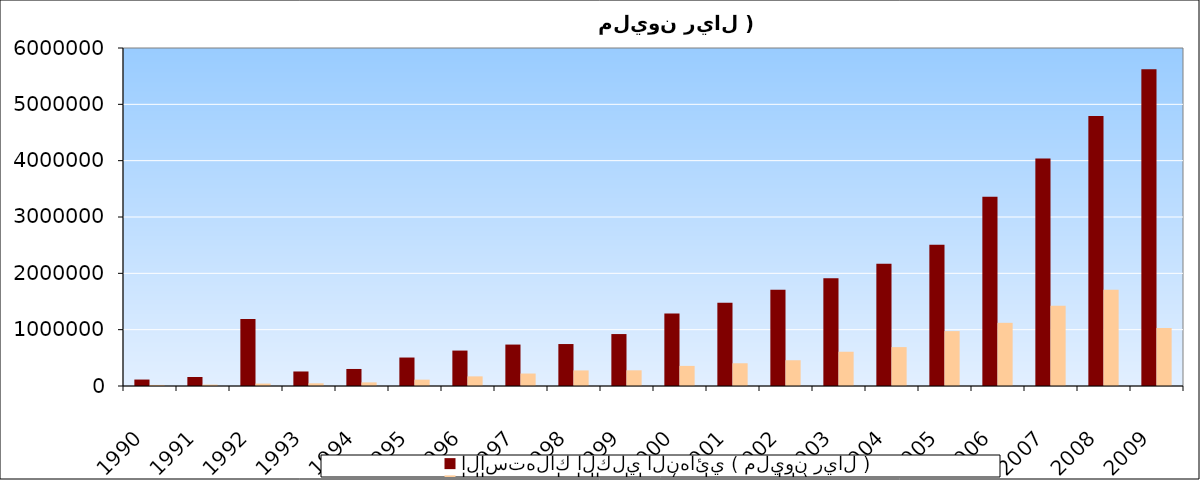
| Category | الاستهلاك الكلي النهائي ( مليون ريال ) | الاستثمار الاجمالي  ( مليون ريال ) |
|---|---|---|
| 1990.0 | 114486 | 18406 |
| 1991.0 | 160028 | 24334 |
| 1992.0 | 1191460 | 43026 |
| 1993.0 | 257732 | 48249 |
| 1994.0 | 302338 | 64390 |
| 1995.0 | 505363 | 112713 |
| 1996.0 | 628881 | 170879 |
| 1997.0 | 735533 | 221215 |
| 1998.0 | 744902 | 276465 |
| 1999.0 | 921968 | 278493 |
| 2000.0 | 1287957 | 356652.994 |
| 2001.0 | 1478665 | 403564.763 |
| 2002.0 | 1707543 | 457262.871 |
| 2003.0 | 1911135 | 608142.143 |
| 2004.0 | 2171428 | 690480.021 |
| 2005.0 | 2509609 | 974448.255 |
| 2006.0 | 3358724.046 | 1121344.404 |
| 2007.0 | 4036550.922 | 1422814.589 |
| 2008.0 | 4794252.587 | 1708597.171 |
| 2009.0 | 5622124.461 | 1029664.562 |